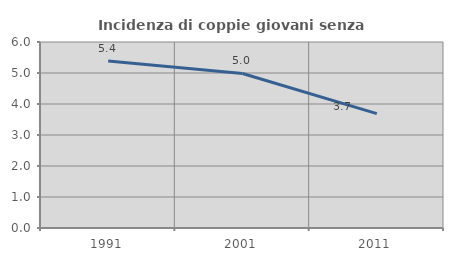
| Category | Incidenza di coppie giovani senza figli |
|---|---|
| 1991.0 | 5.385 |
| 2001.0 | 4.985 |
| 2011.0 | 3.688 |